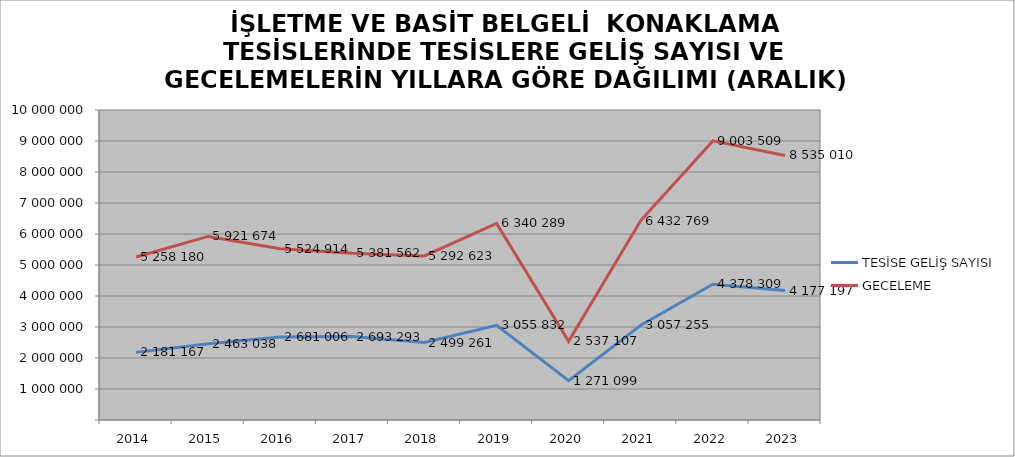
| Category | TESİSE GELİŞ SAYISI | GECELEME |
|---|---|---|
| 2014 | 2181167 | 5258180 |
| 2015 | 2463038 | 5921674 |
| 2016 | 2681006 | 5524914 |
| 2017 | 2693293 | 5381562 |
| 2018 | 2499261 | 5292623 |
| 2019 | 3055832 | 6340289 |
| 2020 | 1271099 | 2537107 |
| 2021 | 3057255 | 6432769 |
| 2022 | 4378309 | 9003509 |
| 2023 | 4177197 | 8535010 |